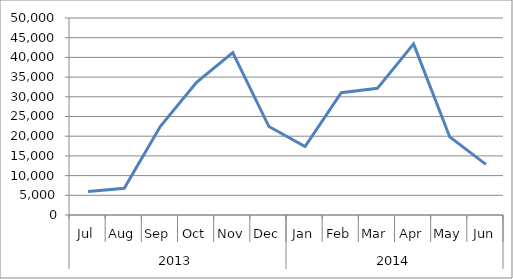
| Category | Series 0 |
|---|---|
| 0 | 5937 |
| 1 | 6795 |
| 2 | 22497 |
| 3 | 33652 |
| 4 | 41195 |
| 5 | 22452 |
| 6 | 17383 |
| 7 | 31039 |
| 8 | 32148 |
| 9 | 43422 |
| 10 | 19817 |
| 11 | 12844 |